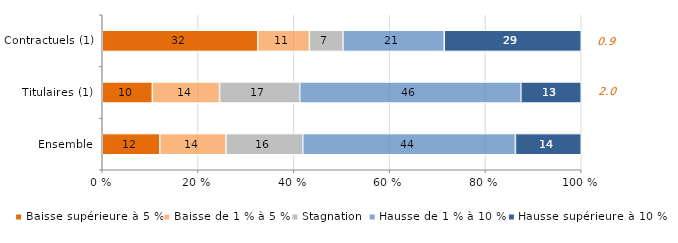
| Category | Baisse supérieure à 5 % | Baisse de 1 % à 5 % | Stagnation | Hausse de 1 % à 10 % | Hausse supérieure à 10 % |
|---|---|---|---|---|---|
| Ensemble | 12.02 | 13.8 | 16.05 | 44.39 | 13.74 |
| Titulaires (1) | 10.46 | 14.03 | 16.74 | 46.16 | 12.61 |
| Contractuels (1) | 32.46 | 10.79 | 7 | 21.14 | 28.61 |